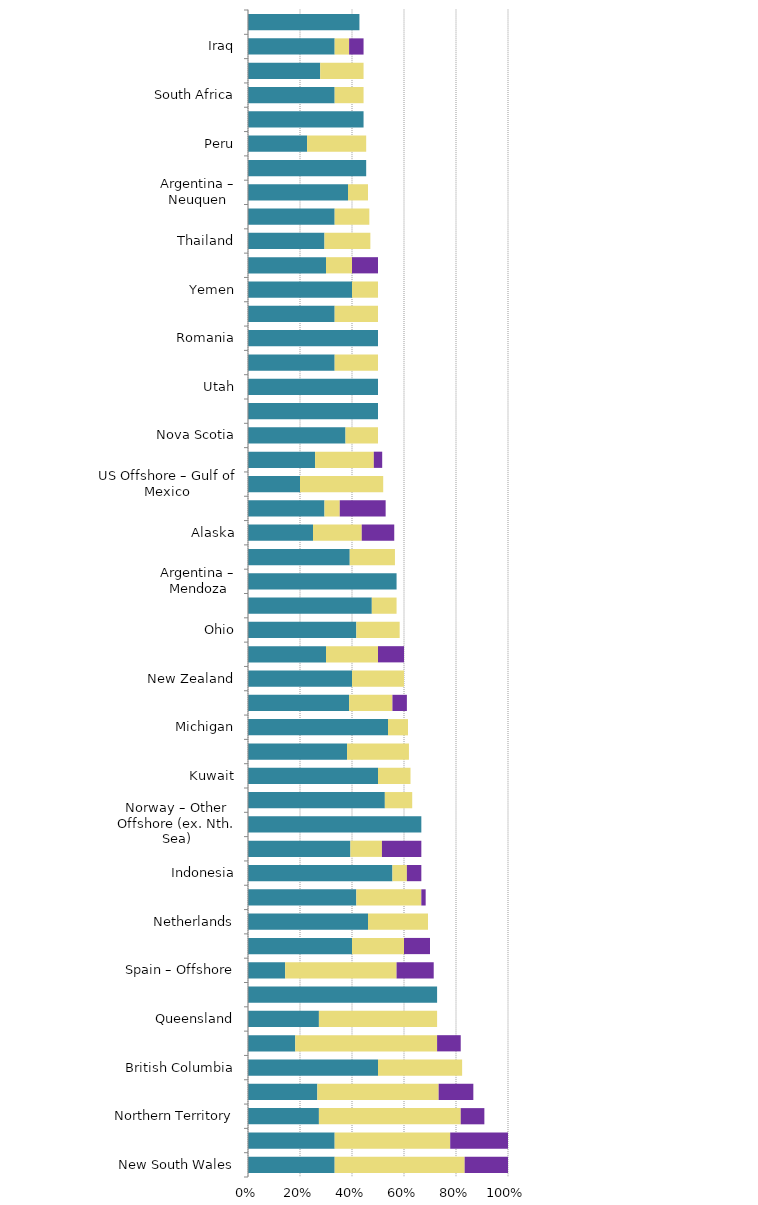
| Category | Mild deterrent to investment | Strong deterrent to investment | Would not pursue investment due to this factor |
|---|---|---|---|
| New South Wales | 0.333 | 0.5 | 0.167 |
| Victoria | 0.333 | 0.444 | 0.222 |
| Northern Territory | 0.273 | 0.545 | 0.091 |
| California | 0.267 | 0.467 | 0.133 |
| British Columbia | 0.5 | 0.324 | 0 |
| France | 0.182 | 0.545 | 0.091 |
| Queensland | 0.273 | 0.455 | 0 |
| Ireland | 0.727 | 0 | 0 |
| Spain – Offshore | 0.143 | 0.429 | 0.143 |
| Bolivia | 0.4 | 0.2 | 0.1 |
| Netherlands | 0.462 | 0.231 | 0 |
| Alberta | 0.417 | 0.25 | 0.017 |
| Indonesia | 0.556 | 0.056 | 0.056 |
| Colorado | 0.394 | 0.121 | 0.152 |
| Norway – Other Offshore (ex. Nth. Sea) | 0.667 | 0 | 0 |
| Norway – North Sea | 0.526 | 0.105 | 0 |
| Kuwait | 0.5 | 0.125 | 0 |
| Australia – Offshore | 0.381 | 0.238 | 0 |
| Michigan | 0.538 | 0.077 | 0 |
| Brazil – Offshore CCs | 0.389 | 0.167 | 0.056 |
| New Zealand | 0.4 | 0.2 | 0 |
| Spain – Onshore | 0.3 | 0.2 | 0.1 |
| Ohio | 0.417 | 0.167 | 0 |
| United Kingdom – North Sea | 0.476 | 0.095 | 0 |
| Argentina – Mendoza | 0.571 | 0 | 0 |
| Western Australia | 0.391 | 0.174 | 0 |
| Alaska | 0.25 | 0.188 | 0.125 |
| Venezuela | 0.294 | 0.059 | 0.176 |
| US Offshore – Gulf of Mexico | 0.2 | 0.32 | 0 |
| Colombia | 0.258 | 0.226 | 0.032 |
| Nova Scotia | 0.375 | 0.125 | 0 |
| Illinois | 0.5 | 0 | 0 |
| Utah | 0.5 | 0 | 0 |
| Hungary | 0.333 | 0.167 | 0 |
| Romania | 0.5 | 0 | 0 |
| UK – Other Offshore (ex. Nth. Sea) | 0.333 | 0.167 | 0 |
| Yemen | 0.4 | 0.1 | 0 |
| Brazil – Offshore presalt PSCs | 0.3 | 0.1 | 0.1 |
| Thailand | 0.294 | 0.176 | 0 |
| US – Pennsylvania | 0.333 | 0.133 | 0 |
| Argentina – Neuquen | 0.385 | 0.077 | 0 |
| Oman | 0.455 | 0 | 0 |
| Peru | 0.227 | 0.227 | 0 |
| Alabama | 0.444 | 0 | 0 |
| South Africa | 0.333 | 0.111 | 0 |
| Algeria | 0.278 | 0.167 | 0 |
| Iraq | 0.333 | 0.056 | 0.056 |
| Tanzania | 0.429 | 0 | 0 |